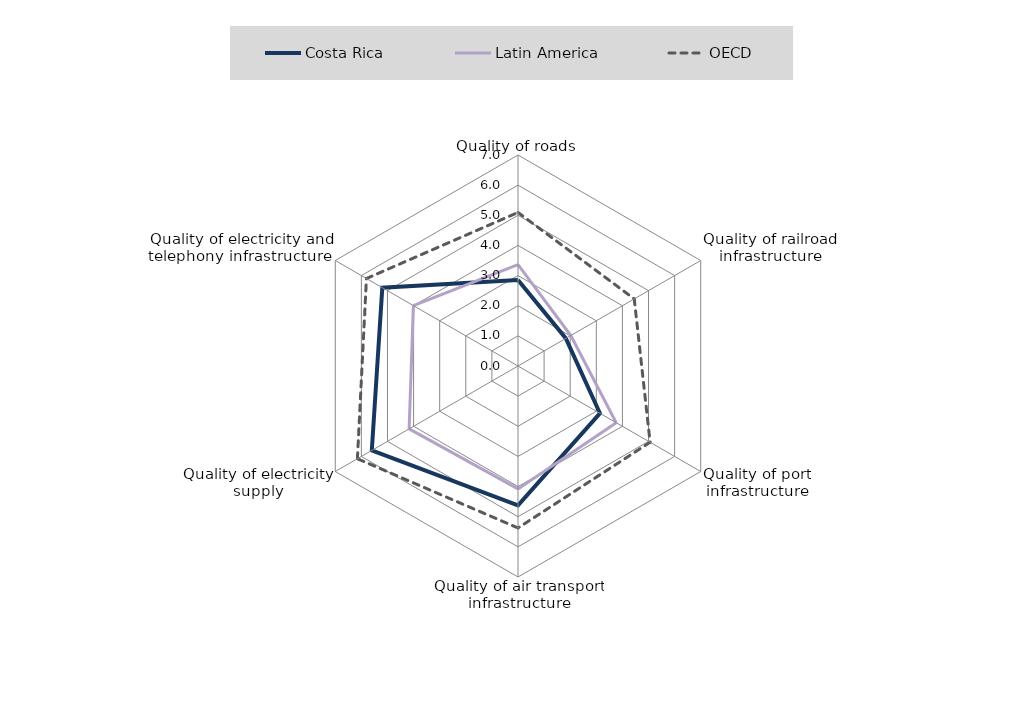
| Category | Costa Rica | Latin America | OECD |
|---|---|---|---|
| Quality of roads | 2.851 | 3.361 | 5.094 |
| Quality of railroad infrastructure | 1.833 | 2.023 | 4.453 |
| Quality of port infrastructure | 3.138 | 3.762 | 5.061 |
| Quality of air transport infrastructure | 4.621 | 4.078 | 5.373 |
| Quality of electricity supply | 5.6 | 4.17 | 6.152 |
| Quality of electricity and telephony infrastructure  | 5.198 | 4.008 | 5.805 |